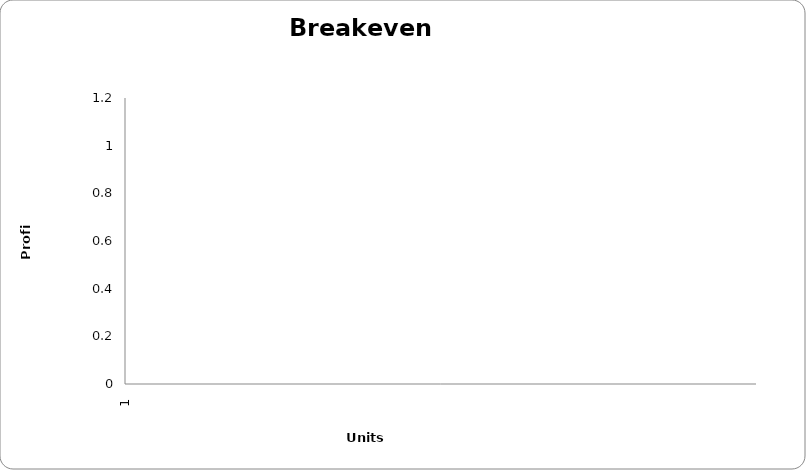
| Category | Series 1 | Series 2 | Series 4 |
|---|---|---|---|
| 0 | 1 | 1 | 1 |